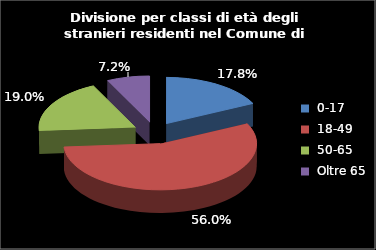
| Category | Series 0 |
|---|---|
| 0-17 | 208 |
| 18-49 | 655 |
| 50-65 | 222 |
| Oltre 65 | 84 |